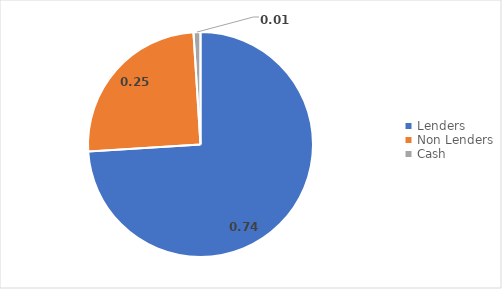
| Category | Weights |
|---|---|
| Lenders  | 0.74 |
| Non Lenders | 0.25 |
| Cash | 0.01 |